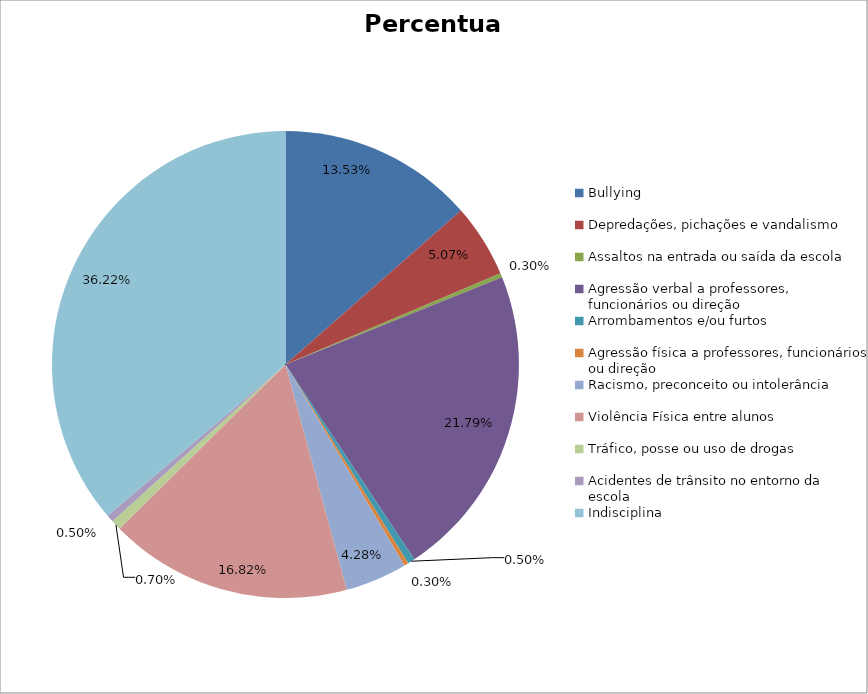
| Category | Percentual |
|---|---|
| Bullying | 0.135 |
| Depredações, pichações e vandalismo | 0.051 |
| Assaltos na entrada ou saída da escola | 0.003 |
| Agressão verbal a professores, funcionários ou direção | 0.218 |
| Arrombamentos e/ou furtos | 0.005 |
| Agressão física a professores, funcionários ou direção | 0.003 |
| Racismo, preconceito ou intolerância | 0.043 |
| Violência Física entre alunos | 0.168 |
| Tráfico, posse ou uso de drogas | 0.007 |
| Acidentes de trânsito no entorno da escola | 0.005 |
| Indisciplina | 0.362 |